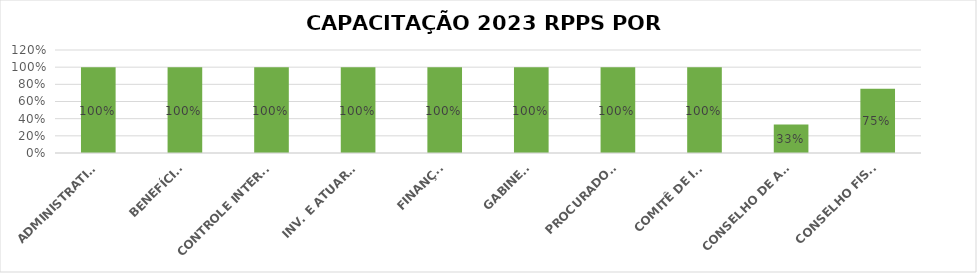
| Category | Series 0 |
|---|---|
| ADMINISTRATIVO | 1 |
| BENEFÍCIOS | 1 |
| CONTROLE INTERNO | 1 |
| INV. E ATUARIAL | 1 |
| FINANÇAS | 1 |
| GABINETE | 1 |
| PROCURADORIA | 1 |
| COMITÊ DE INV. | 1 |
| CONSELHO DE ADM. | 0.333 |
| CONSELHO FISCAL | 0.75 |